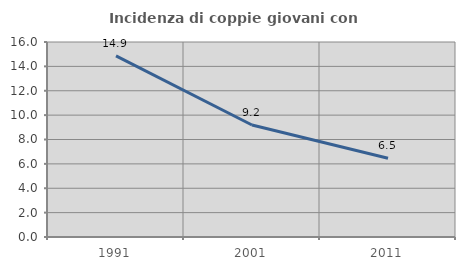
| Category | Incidenza di coppie giovani con figli |
|---|---|
| 1991.0 | 14.862 |
| 2001.0 | 9.192 |
| 2011.0 | 6.46 |